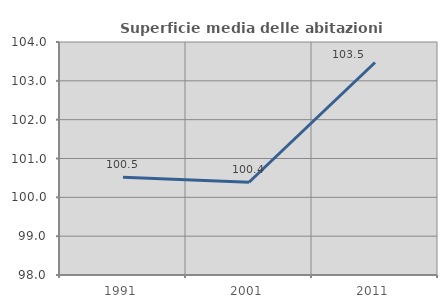
| Category | Superficie media delle abitazioni occupate |
|---|---|
| 1991.0 | 100.519 |
| 2001.0 | 100.388 |
| 2011.0 | 103.473 |